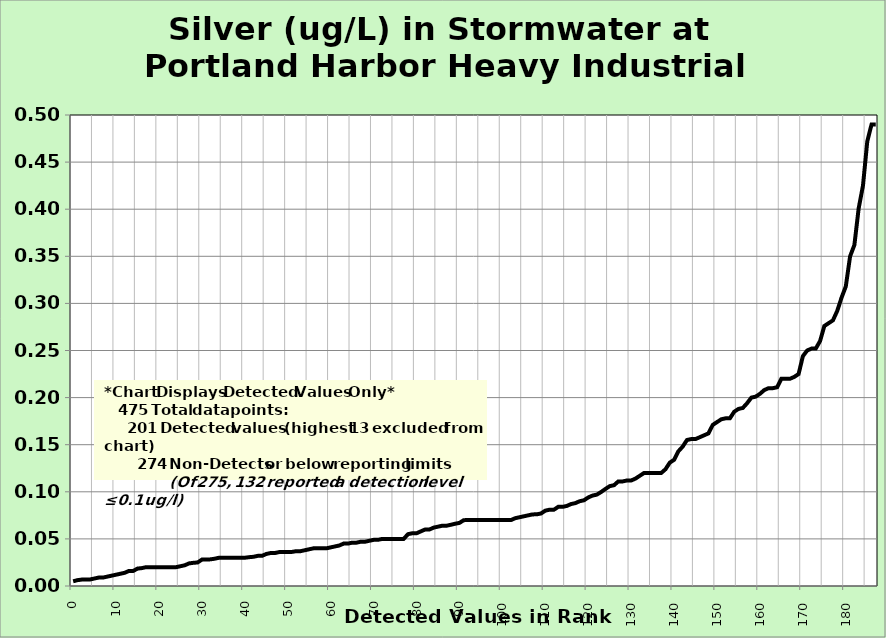
| Category | Silver |
|---|---|
| 0.0 | 0.005 |
| 1.0 | 0.006 |
| 2.0 | 0.007 |
| 3.0 | 0.007 |
| 4.0 | 0.007 |
| 5.0 | 0.008 |
| 6.0 | 0.009 |
| 7.0 | 0.009 |
| 8.0 | 0.01 |
| 9.0 | 0.011 |
| 10.0 | 0.012 |
| 11.0 | 0.013 |
| 12.0 | 0.014 |
| 13.0 | 0.016 |
| 14.0 | 0.016 |
| 15.0 | 0.018 |
| 16.0 | 0.019 |
| 17.0 | 0.02 |
| 18.0 | 0.02 |
| 19.0 | 0.02 |
| 20.0 | 0.02 |
| 21.0 | 0.02 |
| 22.0 | 0.02 |
| 23.0 | 0.02 |
| 24.0 | 0.02 |
| 25.0 | 0.021 |
| 26.0 | 0.022 |
| 27.0 | 0.024 |
| 28.0 | 0.025 |
| 29.0 | 0.025 |
| 30.0 | 0.028 |
| 31.0 | 0.028 |
| 32.0 | 0.028 |
| 33.0 | 0.029 |
| 34.0 | 0.03 |
| 35.0 | 0.03 |
| 36.0 | 0.03 |
| 37.0 | 0.03 |
| 38.0 | 0.03 |
| 39.0 | 0.03 |
| 40.0 | 0.03 |
| 41.0 | 0.031 |
| 42.0 | 0.031 |
| 43.0 | 0.032 |
| 44.0 | 0.032 |
| 45.0 | 0.034 |
| 46.0 | 0.035 |
| 47.0 | 0.035 |
| 48.0 | 0.036 |
| 49.0 | 0.036 |
| 50.0 | 0.036 |
| 51.0 | 0.036 |
| 52.0 | 0.037 |
| 53.0 | 0.037 |
| 54.0 | 0.038 |
| 55.0 | 0.039 |
| 56.0 | 0.04 |
| 57.0 | 0.04 |
| 58.0 | 0.04 |
| 59.0 | 0.04 |
| 60.0 | 0.041 |
| 61.0 | 0.042 |
| 62.0 | 0.043 |
| 63.0 | 0.045 |
| 64.0 | 0.045 |
| 65.0 | 0.046 |
| 66.0 | 0.046 |
| 67.0 | 0.047 |
| 68.0 | 0.047 |
| 69.0 | 0.048 |
| 70.0 | 0.049 |
| 71.0 | 0.049 |
| 72.0 | 0.05 |
| 73.0 | 0.05 |
| 74.0 | 0.05 |
| 75.0 | 0.05 |
| 76.0 | 0.05 |
| 77.0 | 0.05 |
| 78.0 | 0.055 |
| 79.0 | 0.056 |
| 80.0 | 0.056 |
| 81.0 | 0.058 |
| 82.0 | 0.06 |
| 83.0 | 0.06 |
| 84.0 | 0.062 |
| 85.0 | 0.063 |
| 86.0 | 0.064 |
| 87.0 | 0.064 |
| 88.0 | 0.065 |
| 89.0 | 0.066 |
| 90.0 | 0.067 |
| 91.0 | 0.07 |
| 92.0 | 0.07 |
| 93.0 | 0.07 |
| 94.0 | 0.07 |
| 95.0 | 0.07 |
| 96.0 | 0.07 |
| 97.0 | 0.07 |
| 98.0 | 0.07 |
| 99.0 | 0.07 |
| 100.0 | 0.07 |
| 101.0 | 0.07 |
| 102.0 | 0.07 |
| 103.0 | 0.072 |
| 104.0 | 0.073 |
| 105.0 | 0.074 |
| 106.0 | 0.075 |
| 107.0 | 0.076 |
| 108.0 | 0.076 |
| 109.0 | 0.077 |
| 110.0 | 0.08 |
| 111.0 | 0.081 |
| 112.0 | 0.081 |
| 113.0 | 0.084 |
| 114.0 | 0.084 |
| 115.0 | 0.085 |
| 116.0 | 0.087 |
| 117.0 | 0.088 |
| 118.0 | 0.09 |
| 119.0 | 0.091 |
| 120.0 | 0.094 |
| 121.0 | 0.096 |
| 122.0 | 0.097 |
| 123.0 | 0.1 |
| 124.0 | 0.103 |
| 125.0 | 0.106 |
| 126.0 | 0.107 |
| 127.0 | 0.111 |
| 128.0 | 0.111 |
| 129.0 | 0.112 |
| 130.0 | 0.112 |
| 131.0 | 0.114 |
| 132.0 | 0.117 |
| 133.0 | 0.12 |
| 134.0 | 0.12 |
| 135.0 | 0.12 |
| 136.0 | 0.12 |
| 137.0 | 0.12 |
| 138.0 | 0.124 |
| 139.0 | 0.131 |
| 140.0 | 0.134 |
| 141.0 | 0.143 |
| 142.0 | 0.148 |
| 143.0 | 0.155 |
| 144.0 | 0.156 |
| 145.0 | 0.156 |
| 146.0 | 0.158 |
| 147.0 | 0.16 |
| 148.0 | 0.162 |
| 149.0 | 0.171 |
| 150.0 | 0.174 |
| 151.0 | 0.177 |
| 152.0 | 0.178 |
| 153.0 | 0.178 |
| 154.0 | 0.185 |
| 155.0 | 0.188 |
| 156.0 | 0.189 |
| 157.0 | 0.194 |
| 158.0 | 0.2 |
| 159.0 | 0.201 |
| 160.0 | 0.204 |
| 161.0 | 0.208 |
| 162.0 | 0.21 |
| 163.0 | 0.21 |
| 164.0 | 0.211 |
| 165.0 | 0.22 |
| 166.0 | 0.22 |
| 167.0 | 0.22 |
| 168.0 | 0.222 |
| 169.0 | 0.225 |
| 170.0 | 0.244 |
| 171.0 | 0.25 |
| 172.0 | 0.252 |
| 173.0 | 0.252 |
| 174.0 | 0.26 |
| 175.0 | 0.276 |
| 176.0 | 0.279 |
| 177.0 | 0.282 |
| 178.0 | 0.292 |
| 179.0 | 0.306 |
| 180.0 | 0.318 |
| 181.0 | 0.35 |
| 182.0 | 0.362 |
| 183.0 | 0.401 |
| 184.0 | 0.425 |
| 185.0 | 0.472 |
| 186.0 | 0.49 |
| 187.0 | 0.49 |